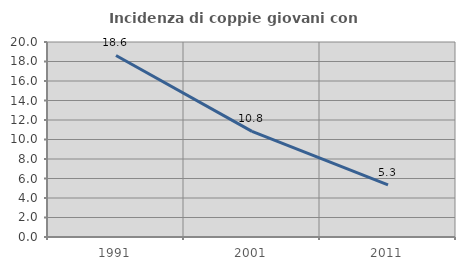
| Category | Incidenza di coppie giovani con figli |
|---|---|
| 1991.0 | 18.622 |
| 2001.0 | 10.838 |
| 2011.0 | 5.34 |